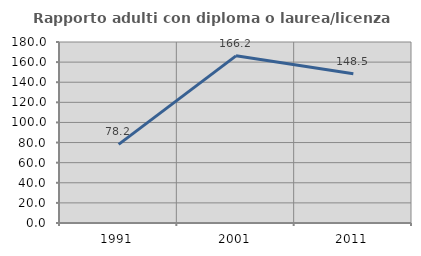
| Category | Rapporto adulti con diploma o laurea/licenza media  |
|---|---|
| 1991.0 | 78.227 |
| 2001.0 | 166.231 |
| 2011.0 | 148.518 |